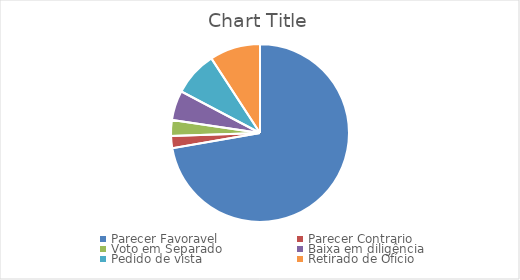
| Category | Series 0 | Series 1 |
|---|---|---|
| Parecer Favoravel | 456 |  |
| Parecer Contrario | 14 |  |
| Voto em Separado  | 18 |  |
| Baixa em diligência | 34 |  |
| Pedido de vista | 51 |  |
| Retirado de Ofício | 58 |  |